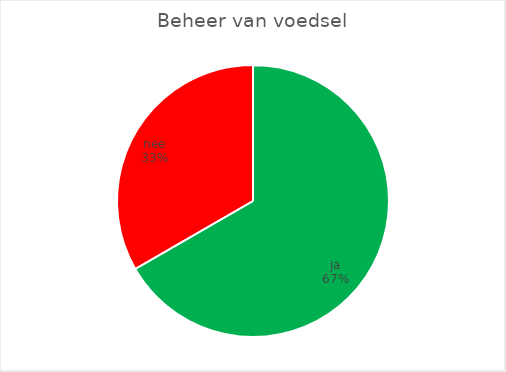
| Category | Beheer van voedsel |
|---|---|
| ja | 8 |
| nee | 4 |